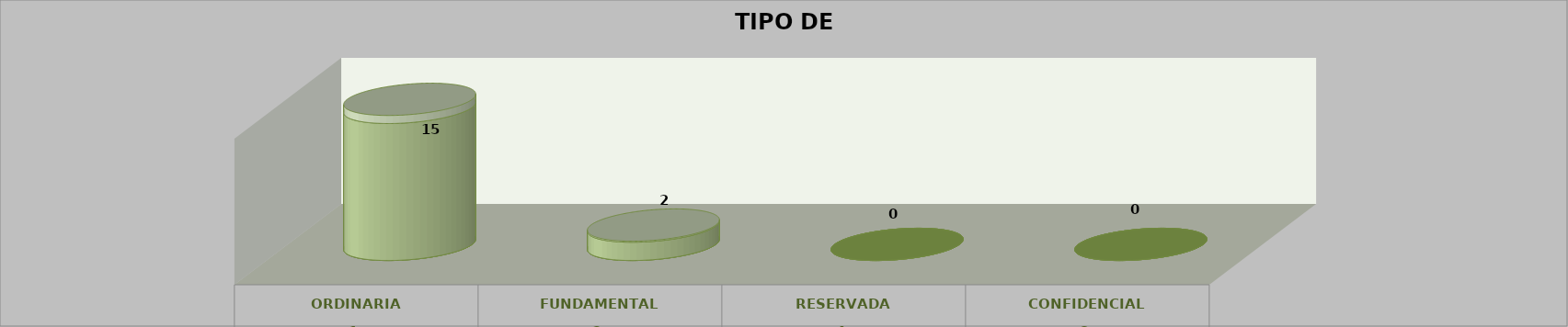
| Category | Series 0 | Series 2 | Series 1 | Series 3 | Series 4 |
|---|---|---|---|---|---|
| 0 |  |  |  | 15 | 0.882 |
| 1 |  |  |  | 2 | 0.118 |
| 2 |  |  |  | 0 | 0 |
| 3 |  |  |  | 0 | 0 |